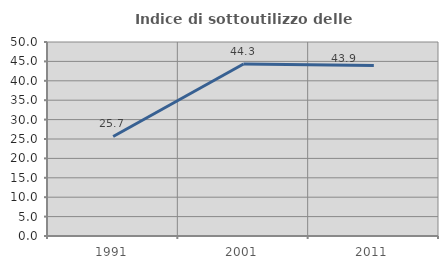
| Category | Indice di sottoutilizzo delle abitazioni  |
|---|---|
| 1991.0 | 25.654 |
| 2001.0 | 44.318 |
| 2011.0 | 43.912 |